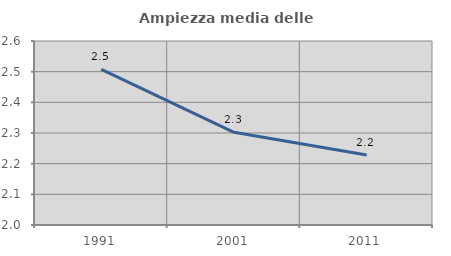
| Category | Ampiezza media delle famiglie |
|---|---|
| 1991.0 | 2.508 |
| 2001.0 | 2.302 |
| 2011.0 | 2.229 |